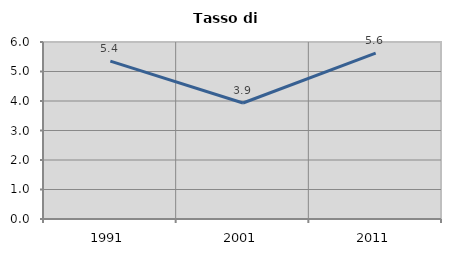
| Category | Tasso di disoccupazione   |
|---|---|
| 1991.0 | 5.35 |
| 2001.0 | 3.931 |
| 2011.0 | 5.622 |